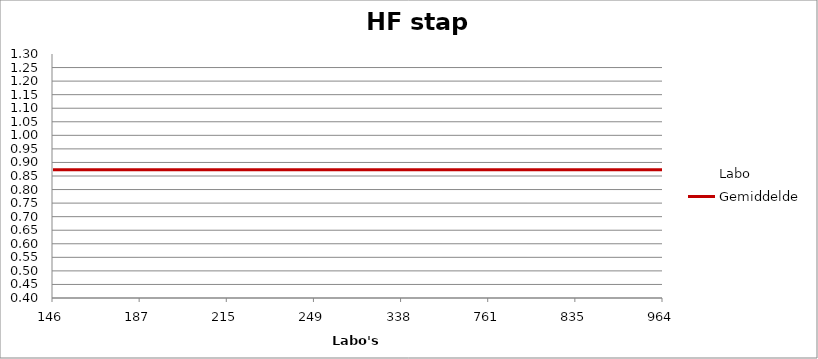
| Category | Labo | Gemiddelde |
|---|---|---|
| 146.0 | 0.429 | 0.873 |
| 187.0 | 0.899 | 0.873 |
| 215.0 | 0.917 | 0.873 |
| 249.0 | 0.821 | 0.873 |
| 338.0 | 0.679 | 0.873 |
| 761.0 | 0.952 | 0.873 |
| 835.0 | 1.25 | 0.873 |
| 964.0 | 0.97 | 0.873 |